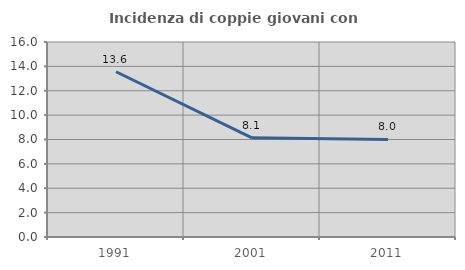
| Category | Incidenza di coppie giovani con figli |
|---|---|
| 1991.0 | 13.558 |
| 2001.0 | 8.136 |
| 2011.0 | 8.003 |